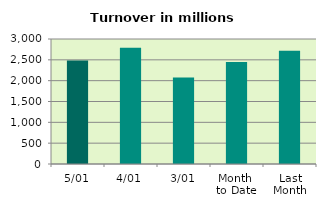
| Category | Series 0 |
|---|---|
| 5/01 | 2484.248 |
| 4/01 | 2787.706 |
| 3/01 | 2073.159 |
| Month 
to Date | 2448.371 |
| Last
Month | 2717.391 |